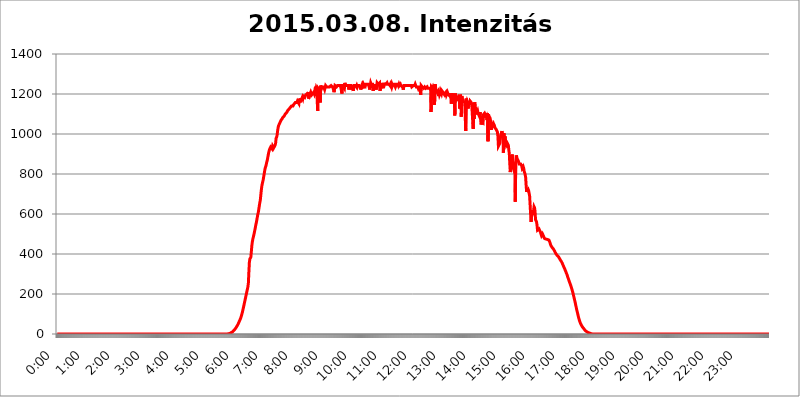
| Category | 2015.03.08. Intenzitás [W/m^2] |
|---|---|
| 0.0 | -0.256 |
| 0.0006944444444444445 | -0.256 |
| 0.001388888888888889 | -0.256 |
| 0.0020833333333333333 | -0.256 |
| 0.002777777777777778 | -0.256 |
| 0.003472222222222222 | -0.256 |
| 0.004166666666666667 | -0.256 |
| 0.004861111111111111 | -0.256 |
| 0.005555555555555556 | -0.256 |
| 0.0062499999999999995 | -0.256 |
| 0.006944444444444444 | -0.256 |
| 0.007638888888888889 | -0.256 |
| 0.008333333333333333 | -0.256 |
| 0.009027777777777779 | -0.256 |
| 0.009722222222222222 | -0.256 |
| 0.010416666666666666 | -0.256 |
| 0.011111111111111112 | -0.256 |
| 0.011805555555555555 | -0.256 |
| 0.012499999999999999 | -0.256 |
| 0.013194444444444444 | -0.256 |
| 0.013888888888888888 | -0.256 |
| 0.014583333333333332 | -0.256 |
| 0.015277777777777777 | -0.256 |
| 0.015972222222222224 | -0.256 |
| 0.016666666666666666 | -0.256 |
| 0.017361111111111112 | -0.256 |
| 0.018055555555555557 | -0.256 |
| 0.01875 | -0.256 |
| 0.019444444444444445 | -0.256 |
| 0.02013888888888889 | -0.256 |
| 0.020833333333333332 | -0.256 |
| 0.02152777777777778 | -0.256 |
| 0.022222222222222223 | -0.256 |
| 0.02291666666666667 | -0.256 |
| 0.02361111111111111 | -0.256 |
| 0.024305555555555556 | -0.256 |
| 0.024999999999999998 | -0.256 |
| 0.025694444444444447 | -0.256 |
| 0.02638888888888889 | -0.256 |
| 0.027083333333333334 | -0.256 |
| 0.027777777777777776 | -0.256 |
| 0.02847222222222222 | -0.256 |
| 0.029166666666666664 | -0.256 |
| 0.029861111111111113 | -0.256 |
| 0.030555555555555555 | -0.256 |
| 0.03125 | -0.256 |
| 0.03194444444444445 | -0.256 |
| 0.03263888888888889 | -0.256 |
| 0.03333333333333333 | -0.256 |
| 0.034027777777777775 | -0.256 |
| 0.034722222222222224 | -0.256 |
| 0.035416666666666666 | -0.256 |
| 0.036111111111111115 | -0.256 |
| 0.03680555555555556 | -0.256 |
| 0.0375 | -0.256 |
| 0.03819444444444444 | -0.256 |
| 0.03888888888888889 | -0.256 |
| 0.03958333333333333 | -0.256 |
| 0.04027777777777778 | -0.256 |
| 0.04097222222222222 | -0.256 |
| 0.041666666666666664 | -0.256 |
| 0.042361111111111106 | -0.256 |
| 0.04305555555555556 | -0.256 |
| 0.043750000000000004 | -0.256 |
| 0.044444444444444446 | -0.256 |
| 0.04513888888888889 | -0.256 |
| 0.04583333333333334 | -0.256 |
| 0.04652777777777778 | -0.256 |
| 0.04722222222222222 | -0.256 |
| 0.04791666666666666 | -0.256 |
| 0.04861111111111111 | -0.256 |
| 0.049305555555555554 | -0.256 |
| 0.049999999999999996 | -0.256 |
| 0.05069444444444445 | -0.256 |
| 0.051388888888888894 | -0.256 |
| 0.052083333333333336 | -0.256 |
| 0.05277777777777778 | -0.256 |
| 0.05347222222222222 | -0.256 |
| 0.05416666666666667 | -0.256 |
| 0.05486111111111111 | -0.256 |
| 0.05555555555555555 | -0.256 |
| 0.05625 | -0.256 |
| 0.05694444444444444 | -0.256 |
| 0.057638888888888885 | -0.256 |
| 0.05833333333333333 | -0.256 |
| 0.05902777777777778 | -0.256 |
| 0.059722222222222225 | -0.256 |
| 0.06041666666666667 | -0.256 |
| 0.061111111111111116 | -0.256 |
| 0.06180555555555556 | -0.256 |
| 0.0625 | -0.256 |
| 0.06319444444444444 | -0.256 |
| 0.06388888888888888 | -0.256 |
| 0.06458333333333334 | -0.256 |
| 0.06527777777777778 | -0.256 |
| 0.06597222222222222 | -0.256 |
| 0.06666666666666667 | -0.256 |
| 0.06736111111111111 | -0.256 |
| 0.06805555555555555 | -0.256 |
| 0.06874999999999999 | -0.256 |
| 0.06944444444444443 | -0.256 |
| 0.07013888888888889 | -0.256 |
| 0.07083333333333333 | -0.256 |
| 0.07152777777777779 | -0.256 |
| 0.07222222222222223 | -0.256 |
| 0.07291666666666667 | -0.256 |
| 0.07361111111111111 | -0.256 |
| 0.07430555555555556 | -0.256 |
| 0.075 | -0.256 |
| 0.07569444444444444 | -0.256 |
| 0.0763888888888889 | -0.256 |
| 0.07708333333333334 | -0.256 |
| 0.07777777777777778 | -0.256 |
| 0.07847222222222222 | -0.256 |
| 0.07916666666666666 | -0.256 |
| 0.0798611111111111 | -0.256 |
| 0.08055555555555556 | -0.256 |
| 0.08125 | -0.256 |
| 0.08194444444444444 | -0.256 |
| 0.08263888888888889 | -0.256 |
| 0.08333333333333333 | -0.256 |
| 0.08402777777777777 | -0.256 |
| 0.08472222222222221 | -0.256 |
| 0.08541666666666665 | -0.256 |
| 0.08611111111111112 | -0.256 |
| 0.08680555555555557 | -0.256 |
| 0.08750000000000001 | -0.256 |
| 0.08819444444444445 | -0.256 |
| 0.08888888888888889 | -0.256 |
| 0.08958333333333333 | -0.256 |
| 0.09027777777777778 | -0.256 |
| 0.09097222222222222 | -0.256 |
| 0.09166666666666667 | -0.256 |
| 0.09236111111111112 | -0.256 |
| 0.09305555555555556 | -0.256 |
| 0.09375 | -0.256 |
| 0.09444444444444444 | -0.256 |
| 0.09513888888888888 | -0.256 |
| 0.09583333333333333 | -0.256 |
| 0.09652777777777777 | -0.256 |
| 0.09722222222222222 | -0.256 |
| 0.09791666666666667 | -0.256 |
| 0.09861111111111111 | -0.256 |
| 0.09930555555555555 | -0.256 |
| 0.09999999999999999 | -0.256 |
| 0.10069444444444443 | -0.256 |
| 0.1013888888888889 | -0.256 |
| 0.10208333333333335 | -0.256 |
| 0.10277777777777779 | -0.256 |
| 0.10347222222222223 | -0.256 |
| 0.10416666666666667 | -0.256 |
| 0.10486111111111111 | -0.256 |
| 0.10555555555555556 | -0.256 |
| 0.10625 | -0.256 |
| 0.10694444444444444 | -0.256 |
| 0.1076388888888889 | -0.256 |
| 0.10833333333333334 | -0.256 |
| 0.10902777777777778 | -0.256 |
| 0.10972222222222222 | -0.256 |
| 0.1111111111111111 | -0.256 |
| 0.11180555555555556 | -0.256 |
| 0.11180555555555556 | -0.256 |
| 0.1125 | -0.256 |
| 0.11319444444444444 | -0.256 |
| 0.11388888888888889 | -0.256 |
| 0.11458333333333333 | -0.256 |
| 0.11527777777777777 | -0.256 |
| 0.11597222222222221 | -0.256 |
| 0.11666666666666665 | -0.256 |
| 0.1173611111111111 | -0.256 |
| 0.11805555555555557 | -0.256 |
| 0.11944444444444445 | -0.256 |
| 0.12013888888888889 | -0.256 |
| 0.12083333333333333 | -0.256 |
| 0.12152777777777778 | -0.256 |
| 0.12222222222222223 | -0.256 |
| 0.12291666666666667 | -0.256 |
| 0.12291666666666667 | -0.256 |
| 0.12361111111111112 | -0.256 |
| 0.12430555555555556 | -0.256 |
| 0.125 | -0.256 |
| 0.12569444444444444 | -0.256 |
| 0.12638888888888888 | -0.256 |
| 0.12708333333333333 | -0.256 |
| 0.16875 | -0.256 |
| 0.12847222222222224 | -0.256 |
| 0.12916666666666668 | -0.256 |
| 0.12986111111111112 | -0.256 |
| 0.13055555555555556 | -0.256 |
| 0.13125 | -0.256 |
| 0.13194444444444445 | -0.256 |
| 0.1326388888888889 | -0.256 |
| 0.13333333333333333 | -0.256 |
| 0.13402777777777777 | -0.256 |
| 0.13402777777777777 | -0.256 |
| 0.13472222222222222 | -0.256 |
| 0.13541666666666666 | -0.256 |
| 0.1361111111111111 | -0.256 |
| 0.13749999999999998 | -0.256 |
| 0.13819444444444443 | -0.256 |
| 0.1388888888888889 | -0.256 |
| 0.13958333333333334 | -0.256 |
| 0.14027777777777778 | -0.256 |
| 0.14097222222222222 | -0.256 |
| 0.14166666666666666 | -0.256 |
| 0.1423611111111111 | -0.256 |
| 0.14305555555555557 | -0.256 |
| 0.14375000000000002 | -0.256 |
| 0.14444444444444446 | -0.256 |
| 0.1451388888888889 | -0.256 |
| 0.1451388888888889 | -0.256 |
| 0.14652777777777778 | -0.256 |
| 0.14722222222222223 | -0.256 |
| 0.14791666666666667 | -0.256 |
| 0.1486111111111111 | -0.256 |
| 0.14930555555555555 | -0.256 |
| 0.15 | -0.256 |
| 0.15069444444444444 | -0.256 |
| 0.15138888888888888 | -0.256 |
| 0.15208333333333332 | -0.256 |
| 0.15277777777777776 | -0.256 |
| 0.15347222222222223 | -0.256 |
| 0.15416666666666667 | -0.256 |
| 0.15486111111111112 | -0.256 |
| 0.15555555555555556 | -0.256 |
| 0.15625 | -0.256 |
| 0.15694444444444444 | -0.256 |
| 0.15763888888888888 | -0.256 |
| 0.15833333333333333 | -0.256 |
| 0.15902777777777777 | -0.256 |
| 0.15972222222222224 | -0.256 |
| 0.16041666666666668 | -0.256 |
| 0.16111111111111112 | -0.256 |
| 0.16180555555555556 | -0.256 |
| 0.1625 | -0.256 |
| 0.16319444444444445 | -0.256 |
| 0.1638888888888889 | -0.256 |
| 0.16458333333333333 | -0.256 |
| 0.16527777777777777 | -0.256 |
| 0.16597222222222222 | -0.256 |
| 0.16666666666666666 | -0.256 |
| 0.1673611111111111 | -0.256 |
| 0.16805555555555554 | -0.256 |
| 0.16874999999999998 | -0.256 |
| 0.16944444444444443 | -0.256 |
| 0.17013888888888887 | -0.256 |
| 0.1708333333333333 | -0.256 |
| 0.17152777777777775 | -0.256 |
| 0.17222222222222225 | -0.256 |
| 0.1729166666666667 | -0.256 |
| 0.17361111111111113 | -0.256 |
| 0.17430555555555557 | -0.256 |
| 0.17500000000000002 | -0.256 |
| 0.17569444444444446 | -0.256 |
| 0.1763888888888889 | -0.256 |
| 0.17708333333333334 | -0.256 |
| 0.17777777777777778 | -0.256 |
| 0.17847222222222223 | -0.256 |
| 0.17916666666666667 | -0.256 |
| 0.1798611111111111 | -0.256 |
| 0.18055555555555555 | -0.256 |
| 0.18125 | -0.256 |
| 0.18194444444444444 | -0.256 |
| 0.1826388888888889 | -0.256 |
| 0.18333333333333335 | -0.256 |
| 0.1840277777777778 | -0.256 |
| 0.18472222222222223 | -0.256 |
| 0.18541666666666667 | -0.256 |
| 0.18611111111111112 | -0.256 |
| 0.18680555555555556 | -0.256 |
| 0.1875 | -0.256 |
| 0.18819444444444444 | -0.256 |
| 0.18888888888888888 | -0.256 |
| 0.18958333333333333 | -0.256 |
| 0.19027777777777777 | -0.256 |
| 0.1909722222222222 | -0.256 |
| 0.19166666666666665 | -0.256 |
| 0.19236111111111112 | -0.256 |
| 0.19305555555555554 | -0.256 |
| 0.19375 | -0.256 |
| 0.19444444444444445 | -0.256 |
| 0.1951388888888889 | -0.256 |
| 0.19583333333333333 | -0.256 |
| 0.19652777777777777 | -0.256 |
| 0.19722222222222222 | -0.256 |
| 0.19791666666666666 | -0.256 |
| 0.1986111111111111 | -0.256 |
| 0.19930555555555554 | -0.256 |
| 0.19999999999999998 | -0.256 |
| 0.20069444444444443 | -0.256 |
| 0.20138888888888887 | -0.256 |
| 0.2020833333333333 | -0.256 |
| 0.2027777777777778 | -0.256 |
| 0.2034722222222222 | -0.256 |
| 0.2041666666666667 | -0.256 |
| 0.20486111111111113 | -0.256 |
| 0.20555555555555557 | -0.256 |
| 0.20625000000000002 | -0.256 |
| 0.20694444444444446 | -0.256 |
| 0.2076388888888889 | -0.256 |
| 0.20833333333333334 | -0.256 |
| 0.20902777777777778 | -0.256 |
| 0.20972222222222223 | -0.256 |
| 0.21041666666666667 | -0.256 |
| 0.2111111111111111 | -0.256 |
| 0.21180555555555555 | -0.256 |
| 0.2125 | -0.256 |
| 0.21319444444444444 | -0.256 |
| 0.2138888888888889 | -0.256 |
| 0.21458333333333335 | -0.256 |
| 0.2152777777777778 | -0.256 |
| 0.21597222222222223 | -0.256 |
| 0.21666666666666667 | -0.256 |
| 0.21736111111111112 | -0.256 |
| 0.21805555555555556 | -0.256 |
| 0.21875 | -0.256 |
| 0.21944444444444444 | -0.256 |
| 0.22013888888888888 | -0.256 |
| 0.22083333333333333 | -0.256 |
| 0.22152777777777777 | -0.256 |
| 0.2222222222222222 | -0.256 |
| 0.22291666666666665 | -0.256 |
| 0.2236111111111111 | -0.256 |
| 0.22430555555555556 | -0.256 |
| 0.225 | -0.256 |
| 0.22569444444444445 | -0.256 |
| 0.2263888888888889 | -0.256 |
| 0.22708333333333333 | -0.256 |
| 0.22777777777777777 | -0.256 |
| 0.22847222222222222 | -0.256 |
| 0.22916666666666666 | -0.256 |
| 0.2298611111111111 | -0.256 |
| 0.23055555555555554 | -0.256 |
| 0.23124999999999998 | -0.256 |
| 0.23194444444444443 | -0.256 |
| 0.23263888888888887 | -0.256 |
| 0.2333333333333333 | -0.256 |
| 0.2340277777777778 | -0.256 |
| 0.2347222222222222 | -0.256 |
| 0.2354166666666667 | -0.256 |
| 0.23611111111111113 | -0.256 |
| 0.23680555555555557 | -0.256 |
| 0.23750000000000002 | -0.256 |
| 0.23819444444444446 | 1.09 |
| 0.2388888888888889 | 1.09 |
| 0.23958333333333334 | 1.09 |
| 0.24027777777777778 | 1.09 |
| 0.24097222222222223 | 1.09 |
| 0.24166666666666667 | 2.439 |
| 0.2423611111111111 | 3.791 |
| 0.24305555555555555 | 3.791 |
| 0.24375 | 6.503 |
| 0.24444444444444446 | 7.862 |
| 0.24513888888888888 | 9.225 |
| 0.24583333333333335 | 10.589 |
| 0.2465277777777778 | 13.325 |
| 0.24722222222222223 | 16.069 |
| 0.24791666666666667 | 17.444 |
| 0.24861111111111112 | 20.201 |
| 0.24930555555555556 | 24.35 |
| 0.25 | 27.124 |
| 0.25069444444444444 | 31.297 |
| 0.2513888888888889 | 35.483 |
| 0.2520833333333333 | 39.68 |
| 0.25277777777777777 | 43.886 |
| 0.2534722222222222 | 48.1 |
| 0.25416666666666665 | 53.73 |
| 0.2548611111111111 | 59.368 |
| 0.2555555555555556 | 65.012 |
| 0.25625000000000003 | 70.658 |
| 0.2569444444444445 | 76.304 |
| 0.2576388888888889 | 83.356 |
| 0.25833333333333336 | 91.806 |
| 0.2590277777777778 | 100.233 |
| 0.25972222222222224 | 110.025 |
| 0.2604166666666667 | 121.152 |
| 0.2611111111111111 | 132.196 |
| 0.26180555555555557 | 143.144 |
| 0.2625 | 155.333 |
| 0.26319444444444445 | 166.044 |
| 0.2638888888888889 | 177.946 |
| 0.26458333333333334 | 189.685 |
| 0.2652777777777778 | 201.258 |
| 0.2659722222222222 | 212.664 |
| 0.26666666666666666 | 223.906 |
| 0.2673611111111111 | 234.99 |
| 0.26805555555555555 | 254.333 |
| 0.26875 | 308.129 |
| 0.26944444444444443 | 357.196 |
| 0.2701388888888889 | 375.442 |
| 0.2708333333333333 | 374.206 |
| 0.27152777777777776 | 384.191 |
| 0.2722222222222222 | 411.638 |
| 0.27291666666666664 | 441.469 |
| 0.2736111111111111 | 459.898 |
| 0.2743055555555555 | 474.507 |
| 0.27499999999999997 | 484.662 |
| 0.27569444444444446 | 495.176 |
| 0.27638888888888885 | 506.072 |
| 0.27708333333333335 | 519.3 |
| 0.2777777777777778 | 531.108 |
| 0.27847222222222223 | 545.467 |
| 0.2791666666666667 | 556.131 |
| 0.2798611111111111 | 569.398 |
| 0.28055555555555556 | 583.206 |
| 0.28125 | 597.582 |
| 0.28194444444444444 | 607.495 |
| 0.2826388888888889 | 622.881 |
| 0.2833333333333333 | 638.912 |
| 0.28402777777777777 | 655.618 |
| 0.2847222222222222 | 667.146 |
| 0.28541666666666665 | 691.18 |
| 0.28611111111111115 | 716.58 |
| 0.28680555555555554 | 736.574 |
| 0.28750000000000003 | 750.371 |
| 0.2881944444444445 | 760.972 |
| 0.2888888888888889 | 771.794 |
| 0.28958333333333336 | 786.575 |
| 0.2902777777777778 | 801.768 |
| 0.29097222222222224 | 817.382 |
| 0.2916666666666667 | 829.377 |
| 0.2923611111111111 | 837.51 |
| 0.29305555555555557 | 845.755 |
| 0.29375 | 858.335 |
| 0.29444444444444445 | 866.865 |
| 0.2951388888888889 | 879.878 |
| 0.29583333333333334 | 893.157 |
| 0.2965277777777778 | 906.707 |
| 0.2972222222222222 | 915.893 |
| 0.29791666666666666 | 925.203 |
| 0.2986111111111111 | 929.905 |
| 0.29930555555555555 | 934.639 |
| 0.3 | 934.639 |
| 0.30069444444444443 | 929.905 |
| 0.3013888888888889 | 925.203 |
| 0.3020833333333333 | 939.404 |
| 0.30277777777777776 | 939.404 |
| 0.3034722222222222 | 929.905 |
| 0.30416666666666664 | 934.639 |
| 0.3048611111111111 | 929.905 |
| 0.3055555555555555 | 944.201 |
| 0.30624999999999997 | 953.892 |
| 0.3069444444444444 | 978.688 |
| 0.3076388888888889 | 983.747 |
| 0.30833333333333335 | 993.965 |
| 0.3090277777777778 | 1014.809 |
| 0.30972222222222223 | 1030.804 |
| 0.3104166666666667 | 1041.644 |
| 0.3111111111111111 | 1047.117 |
| 0.31180555555555556 | 1052.625 |
| 0.3125 | 1058.17 |
| 0.31319444444444444 | 1063.751 |
| 0.3138888888888889 | 1069.368 |
| 0.3145833333333333 | 1069.368 |
| 0.31527777777777777 | 1075.021 |
| 0.3159722222222222 | 1080.711 |
| 0.31666666666666665 | 1080.711 |
| 0.31736111111111115 | 1086.439 |
| 0.31805555555555554 | 1086.439 |
| 0.31875000000000003 | 1092.203 |
| 0.3194444444444445 | 1098.004 |
| 0.3201388888888889 | 1098.004 |
| 0.32083333333333336 | 1103.843 |
| 0.3215277777777778 | 1103.843 |
| 0.32222222222222224 | 1109.72 |
| 0.3229166666666667 | 1115.634 |
| 0.3236111111111111 | 1115.634 |
| 0.32430555555555557 | 1121.587 |
| 0.325 | 1121.587 |
| 0.32569444444444445 | 1127.578 |
| 0.3263888888888889 | 1127.578 |
| 0.32708333333333334 | 1133.607 |
| 0.3277777777777778 | 1133.607 |
| 0.3284722222222222 | 1139.675 |
| 0.32916666666666666 | 1139.675 |
| 0.3298611111111111 | 1139.675 |
| 0.33055555555555555 | 1139.675 |
| 0.33125 | 1145.782 |
| 0.33194444444444443 | 1145.782 |
| 0.3326388888888889 | 1151.928 |
| 0.3333333333333333 | 1151.928 |
| 0.3340277777777778 | 1158.113 |
| 0.3347222222222222 | 1158.113 |
| 0.3354166666666667 | 1158.113 |
| 0.3361111111111111 | 1158.113 |
| 0.3368055555555556 | 1164.337 |
| 0.33749999999999997 | 1164.337 |
| 0.33819444444444446 | 1164.337 |
| 0.33888888888888885 | 1151.928 |
| 0.33958333333333335 | 1176.905 |
| 0.34027777777777773 | 1176.905 |
| 0.34097222222222223 | 1158.113 |
| 0.3416666666666666 | 1176.905 |
| 0.3423611111111111 | 1164.337 |
| 0.3430555555555555 | 1176.905 |
| 0.34375 | 1183.249 |
| 0.3444444444444445 | 1176.905 |
| 0.3451388888888889 | 1189.633 |
| 0.3458333333333334 | 1189.633 |
| 0.34652777777777777 | 1189.633 |
| 0.34722222222222227 | 1183.249 |
| 0.34791666666666665 | 1189.633 |
| 0.34861111111111115 | 1196.058 |
| 0.34930555555555554 | 1196.058 |
| 0.35000000000000003 | 1196.058 |
| 0.3506944444444444 | 1202.523 |
| 0.3513888888888889 | 1202.523 |
| 0.3520833333333333 | 1196.058 |
| 0.3527777777777778 | 1176.905 |
| 0.3534722222222222 | 1209.029 |
| 0.3541666666666667 | 1196.058 |
| 0.3548611111111111 | 1202.523 |
| 0.35555555555555557 | 1209.029 |
| 0.35625 | 1209.029 |
| 0.35694444444444445 | 1196.058 |
| 0.3576388888888889 | 1196.058 |
| 0.35833333333333334 | 1202.523 |
| 0.3590277777777778 | 1202.523 |
| 0.3597222222222222 | 1209.029 |
| 0.36041666666666666 | 1202.523 |
| 0.3611111111111111 | 1215.576 |
| 0.36180555555555555 | 1209.029 |
| 0.3625 | 1215.576 |
| 0.36319444444444443 | 1228.794 |
| 0.3638888888888889 | 1222.164 |
| 0.3645833333333333 | 1222.164 |
| 0.3652777777777778 | 1115.634 |
| 0.3659722222222222 | 1228.794 |
| 0.3666666666666667 | 1228.794 |
| 0.3673611111111111 | 1222.164 |
| 0.3680555555555556 | 1235.465 |
| 0.36874999999999997 | 1158.113 |
| 0.36944444444444446 | 1242.179 |
| 0.37013888888888885 | 1235.465 |
| 0.37083333333333335 | 1228.794 |
| 0.37152777777777773 | 1235.465 |
| 0.37222222222222223 | 1235.465 |
| 0.3729166666666666 | 1235.465 |
| 0.3736111111111111 | 1235.465 |
| 0.3743055555555555 | 1235.465 |
| 0.375 | 1222.164 |
| 0.3756944444444445 | 1222.164 |
| 0.3763888888888889 | 1242.179 |
| 0.3770833333333334 | 1242.179 |
| 0.37777777777777777 | 1235.465 |
| 0.37847222222222227 | 1235.465 |
| 0.37916666666666665 | 1235.465 |
| 0.37986111111111115 | 1235.465 |
| 0.38055555555555554 | 1235.465 |
| 0.38125000000000003 | 1235.465 |
| 0.3819444444444444 | 1235.465 |
| 0.3826388888888889 | 1235.465 |
| 0.3833333333333333 | 1235.465 |
| 0.3840277777777778 | 1242.179 |
| 0.3847222222222222 | 1242.179 |
| 0.3854166666666667 | 1242.179 |
| 0.3861111111111111 | 1235.465 |
| 0.38680555555555557 | 1235.465 |
| 0.3875 | 1222.164 |
| 0.38819444444444445 | 1209.029 |
| 0.3888888888888889 | 1209.029 |
| 0.38958333333333334 | 1242.179 |
| 0.3902777777777778 | 1242.179 |
| 0.3909722222222222 | 1242.179 |
| 0.39166666666666666 | 1235.465 |
| 0.3923611111111111 | 1235.465 |
| 0.39305555555555555 | 1242.179 |
| 0.39375 | 1242.179 |
| 0.39444444444444443 | 1242.179 |
| 0.3951388888888889 | 1242.179 |
| 0.3958333333333333 | 1242.179 |
| 0.3965277777777778 | 1242.179 |
| 0.3972222222222222 | 1242.179 |
| 0.3979166666666667 | 1228.794 |
| 0.3986111111111111 | 1228.794 |
| 0.3993055555555556 | 1202.523 |
| 0.39999999999999997 | 1248.934 |
| 0.40069444444444446 | 1242.179 |
| 0.40138888888888885 | 1242.179 |
| 0.40208333333333335 | 1242.179 |
| 0.40277777777777773 | 1228.794 |
| 0.40347222222222223 | 1255.731 |
| 0.4041666666666666 | 1242.179 |
| 0.4048611111111111 | 1242.179 |
| 0.4055555555555555 | 1242.179 |
| 0.40625 | 1242.179 |
| 0.4069444444444445 | 1242.179 |
| 0.4076388888888889 | 1242.179 |
| 0.4083333333333334 | 1242.179 |
| 0.40902777777777777 | 1222.164 |
| 0.40972222222222227 | 1242.179 |
| 0.41041666666666665 | 1242.179 |
| 0.41111111111111115 | 1242.179 |
| 0.41180555555555554 | 1242.179 |
| 0.41250000000000003 | 1242.179 |
| 0.4131944444444444 | 1222.164 |
| 0.4138888888888889 | 1242.179 |
| 0.4145833333333333 | 1242.179 |
| 0.4152777777777778 | 1215.576 |
| 0.4159722222222222 | 1242.179 |
| 0.4166666666666667 | 1242.179 |
| 0.4173611111111111 | 1242.179 |
| 0.41805555555555557 | 1242.179 |
| 0.41875 | 1242.179 |
| 0.41944444444444445 | 1235.465 |
| 0.4201388888888889 | 1242.179 |
| 0.42083333333333334 | 1235.465 |
| 0.4215277777777778 | 1242.179 |
| 0.4222222222222222 | 1242.179 |
| 0.42291666666666666 | 1242.179 |
| 0.4236111111111111 | 1242.179 |
| 0.42430555555555555 | 1242.179 |
| 0.425 | 1235.465 |
| 0.42569444444444443 | 1222.164 |
| 0.4263888888888889 | 1235.465 |
| 0.4270833333333333 | 1235.465 |
| 0.4277777777777778 | 1248.934 |
| 0.4284722222222222 | 1242.179 |
| 0.4291666666666667 | 1248.934 |
| 0.4298611111111111 | 1248.934 |
| 0.4305555555555556 | 1235.465 |
| 0.43124999999999997 | 1228.794 |
| 0.43194444444444446 | 1248.934 |
| 0.43263888888888885 | 1248.934 |
| 0.43333333333333335 | 1248.934 |
| 0.43402777777777773 | 1248.934 |
| 0.43472222222222223 | 1248.934 |
| 0.4354166666666666 | 1248.934 |
| 0.4361111111111111 | 1248.934 |
| 0.4368055555555555 | 1248.934 |
| 0.4375 | 1235.465 |
| 0.4381944444444445 | 1222.164 |
| 0.4388888888888889 | 1242.179 |
| 0.4395833333333334 | 1255.731 |
| 0.44027777777777777 | 1248.934 |
| 0.44097222222222227 | 1248.934 |
| 0.44166666666666665 | 1248.934 |
| 0.44236111111111115 | 1248.934 |
| 0.44305555555555554 | 1215.576 |
| 0.44375000000000003 | 1228.794 |
| 0.4444444444444444 | 1248.934 |
| 0.4451388888888889 | 1235.465 |
| 0.4458333333333333 | 1248.934 |
| 0.4465277777777778 | 1248.934 |
| 0.4472222222222222 | 1222.164 |
| 0.4479166666666667 | 1235.465 |
| 0.4486111111111111 | 1255.731 |
| 0.44930555555555557 | 1255.731 |
| 0.45 | 1248.934 |
| 0.45069444444444445 | 1248.934 |
| 0.4513888888888889 | 1248.934 |
| 0.45208333333333334 | 1255.731 |
| 0.4527777777777778 | 1215.576 |
| 0.4534722222222222 | 1248.934 |
| 0.45416666666666666 | 1248.934 |
| 0.4548611111111111 | 1248.934 |
| 0.45555555555555555 | 1248.934 |
| 0.45625 | 1248.934 |
| 0.45694444444444443 | 1248.934 |
| 0.4576388888888889 | 1228.794 |
| 0.4583333333333333 | 1255.731 |
| 0.4590277777777778 | 1248.934 |
| 0.4597222222222222 | 1248.934 |
| 0.4604166666666667 | 1248.934 |
| 0.4611111111111111 | 1248.934 |
| 0.4618055555555556 | 1248.934 |
| 0.46249999999999997 | 1255.731 |
| 0.46319444444444446 | 1248.934 |
| 0.46388888888888885 | 1248.934 |
| 0.46458333333333335 | 1248.934 |
| 0.46527777777777773 | 1248.934 |
| 0.46597222222222223 | 1248.934 |
| 0.4666666666666666 | 1242.179 |
| 0.4673611111111111 | 1248.934 |
| 0.4680555555555555 | 1242.179 |
| 0.46875 | 1235.465 |
| 0.4694444444444445 | 1248.934 |
| 0.4701388888888889 | 1242.179 |
| 0.4708333333333334 | 1248.934 |
| 0.47152777777777777 | 1248.934 |
| 0.47222222222222227 | 1248.934 |
| 0.47291666666666665 | 1248.934 |
| 0.47361111111111115 | 1248.934 |
| 0.47430555555555554 | 1235.465 |
| 0.47500000000000003 | 1235.465 |
| 0.4756944444444444 | 1248.934 |
| 0.4763888888888889 | 1248.934 |
| 0.4770833333333333 | 1248.934 |
| 0.4777777777777778 | 1248.934 |
| 0.4784722222222222 | 1242.179 |
| 0.4791666666666667 | 1248.934 |
| 0.4798611111111111 | 1242.179 |
| 0.48055555555555557 | 1242.179 |
| 0.48125 | 1248.934 |
| 0.48194444444444445 | 1242.179 |
| 0.4826388888888889 | 1242.179 |
| 0.48333333333333334 | 1242.179 |
| 0.4840277777777778 | 1235.465 |
| 0.4847222222222222 | 1242.179 |
| 0.48541666666666666 | 1222.164 |
| 0.4861111111111111 | 1242.179 |
| 0.48680555555555555 | 1242.179 |
| 0.4875 | 1242.179 |
| 0.48819444444444443 | 1242.179 |
| 0.4888888888888889 | 1242.179 |
| 0.4895833333333333 | 1242.179 |
| 0.4902777777777778 | 1242.179 |
| 0.4909722222222222 | 1242.179 |
| 0.4916666666666667 | 1242.179 |
| 0.4923611111111111 | 1242.179 |
| 0.4930555555555556 | 1242.179 |
| 0.49374999999999997 | 1242.179 |
| 0.49444444444444446 | 1242.179 |
| 0.49513888888888885 | 1242.179 |
| 0.49583333333333335 | 1242.179 |
| 0.49652777777777773 | 1242.179 |
| 0.49722222222222223 | 1235.465 |
| 0.4979166666666666 | 1235.465 |
| 0.4986111111111111 | 1235.465 |
| 0.4993055555555555 | 1242.179 |
| 0.5 | 1242.179 |
| 0.5006944444444444 | 1242.179 |
| 0.5013888888888889 | 1242.179 |
| 0.5020833333333333 | 1248.934 |
| 0.5027777777777778 | 1242.179 |
| 0.5034722222222222 | 1235.465 |
| 0.5041666666666667 | 1235.465 |
| 0.5048611111111111 | 1235.465 |
| 0.5055555555555555 | 1235.465 |
| 0.50625 | 1228.794 |
| 0.5069444444444444 | 1235.465 |
| 0.5076388888888889 | 1235.465 |
| 0.5083333333333333 | 1235.465 |
| 0.5090277777777777 | 1235.465 |
| 0.5097222222222222 | 1196.058 |
| 0.5104166666666666 | 1242.179 |
| 0.5111111111111112 | 1242.179 |
| 0.5118055555555555 | 1235.465 |
| 0.5125000000000001 | 1235.465 |
| 0.5131944444444444 | 1235.465 |
| 0.513888888888889 | 1228.794 |
| 0.5145833333333333 | 1228.794 |
| 0.5152777777777778 | 1235.465 |
| 0.5159722222222222 | 1235.465 |
| 0.5166666666666667 | 1228.794 |
| 0.517361111111111 | 1228.794 |
| 0.5180555555555556 | 1228.794 |
| 0.5187499999999999 | 1235.465 |
| 0.5194444444444445 | 1228.794 |
| 0.5201388888888888 | 1228.794 |
| 0.5208333333333334 | 1228.794 |
| 0.5215277777777778 | 1228.794 |
| 0.5222222222222223 | 1228.794 |
| 0.5229166666666667 | 1228.794 |
| 0.5236111111111111 | 1228.794 |
| 0.5243055555555556 | 1109.72 |
| 0.525 | 1235.465 |
| 0.5256944444444445 | 1235.465 |
| 0.5263888888888889 | 1228.794 |
| 0.5270833333333333 | 1235.465 |
| 0.5277777777777778 | 1228.794 |
| 0.5284722222222222 | 1215.576 |
| 0.5291666666666667 | 1145.782 |
| 0.5298611111111111 | 1248.934 |
| 0.5305555555555556 | 1235.465 |
| 0.53125 | 1235.465 |
| 0.5319444444444444 | 1202.523 |
| 0.5326388888888889 | 1209.029 |
| 0.5333333333333333 | 1209.029 |
| 0.5340277777777778 | 1215.576 |
| 0.5347222222222222 | 1189.633 |
| 0.5354166666666667 | 1209.029 |
| 0.5361111111111111 | 1196.058 |
| 0.5368055555555555 | 1202.523 |
| 0.5375 | 1215.576 |
| 0.5381944444444444 | 1215.576 |
| 0.5388888888888889 | 1202.523 |
| 0.5395833333333333 | 1215.576 |
| 0.5402777777777777 | 1215.576 |
| 0.5409722222222222 | 1209.029 |
| 0.5416666666666666 | 1202.523 |
| 0.5423611111111112 | 1202.523 |
| 0.5430555555555555 | 1196.058 |
| 0.5437500000000001 | 1202.523 |
| 0.5444444444444444 | 1202.523 |
| 0.545138888888889 | 1209.029 |
| 0.5458333333333333 | 1196.058 |
| 0.5465277777777778 | 1196.058 |
| 0.5472222222222222 | 1209.029 |
| 0.5479166666666667 | 1202.523 |
| 0.548611111111111 | 1196.058 |
| 0.5493055555555556 | 1196.058 |
| 0.5499999999999999 | 1196.058 |
| 0.5506944444444445 | 1189.633 |
| 0.5513888888888888 | 1196.058 |
| 0.5520833333333334 | 1202.523 |
| 0.5527777777777778 | 1151.928 |
| 0.5534722222222223 | 1202.523 |
| 0.5541666666666667 | 1196.058 |
| 0.5548611111111111 | 1202.523 |
| 0.5555555555555556 | 1164.337 |
| 0.55625 | 1196.058 |
| 0.5569444444444445 | 1183.249 |
| 0.5576388888888889 | 1092.203 |
| 0.5583333333333333 | 1202.523 |
| 0.5590277777777778 | 1183.249 |
| 0.5597222222222222 | 1176.905 |
| 0.5604166666666667 | 1170.601 |
| 0.5611111111111111 | 1164.337 |
| 0.5618055555555556 | 1189.633 |
| 0.5625 | 1183.249 |
| 0.5631944444444444 | 1189.633 |
| 0.5638888888888889 | 1196.058 |
| 0.5645833333333333 | 1127.578 |
| 0.5652777777777778 | 1196.058 |
| 0.5659722222222222 | 1189.633 |
| 0.5666666666666667 | 1086.439 |
| 0.5673611111111111 | 1189.633 |
| 0.5680555555555555 | 1176.905 |
| 0.56875 | 1176.905 |
| 0.5694444444444444 | 1164.337 |
| 0.5701388888888889 | 1164.337 |
| 0.5708333333333333 | 1164.337 |
| 0.5715277777777777 | 1158.113 |
| 0.5722222222222222 | 1158.113 |
| 0.5729166666666666 | 1014.809 |
| 0.5736111111111112 | 1176.905 |
| 0.5743055555555555 | 1151.928 |
| 0.5750000000000001 | 1164.337 |
| 0.5756944444444444 | 1158.113 |
| 0.576388888888889 | 1127.578 |
| 0.5770833333333333 | 1164.337 |
| 0.5777777777777778 | 1164.337 |
| 0.5784722222222222 | 1145.782 |
| 0.5791666666666667 | 1164.337 |
| 0.579861111111111 | 1164.337 |
| 0.5805555555555556 | 1158.113 |
| 0.5812499999999999 | 1151.928 |
| 0.5819444444444445 | 1151.928 |
| 0.5826388888888888 | 1151.928 |
| 0.5833333333333334 | 1025.437 |
| 0.5840277777777778 | 1098.004 |
| 0.5847222222222223 | 1075.021 |
| 0.5854166666666667 | 1158.113 |
| 0.5861111111111111 | 1139.675 |
| 0.5868055555555556 | 1127.578 |
| 0.5875 | 1098.004 |
| 0.5881944444444445 | 1098.004 |
| 0.5888888888888889 | 1109.72 |
| 0.5895833333333333 | 1115.634 |
| 0.5902777777777778 | 1103.843 |
| 0.5909722222222222 | 1103.843 |
| 0.5916666666666667 | 1092.203 |
| 0.5923611111111111 | 1098.004 |
| 0.5930555555555556 | 1109.72 |
| 0.59375 | 1075.021 |
| 0.5944444444444444 | 1047.117 |
| 0.5951388888888889 | 1047.117 |
| 0.5958333333333333 | 1063.751 |
| 0.5965277777777778 | 1063.751 |
| 0.5972222222222222 | 1058.17 |
| 0.5979166666666667 | 1098.004 |
| 0.5986111111111111 | 1098.004 |
| 0.5993055555555555 | 1103.843 |
| 0.6 | 1098.004 |
| 0.6006944444444444 | 1103.843 |
| 0.6013888888888889 | 1080.711 |
| 0.6020833333333333 | 1086.439 |
| 0.6027777777777777 | 1069.368 |
| 0.6034722222222222 | 1103.843 |
| 0.6041666666666666 | 963.712 |
| 0.6048611111111112 | 1098.004 |
| 0.6055555555555555 | 1086.439 |
| 0.6062500000000001 | 1086.439 |
| 0.6069444444444444 | 1080.711 |
| 0.607638888888889 | 1069.368 |
| 0.6083333333333333 | 1063.751 |
| 0.6090277777777778 | 1020.106 |
| 0.6097222222222222 | 1058.17 |
| 0.6104166666666667 | 1058.17 |
| 0.611111111111111 | 1047.117 |
| 0.6118055555555556 | 1052.625 |
| 0.6124999999999999 | 1052.625 |
| 0.6131944444444445 | 1041.644 |
| 0.6138888888888888 | 1030.804 |
| 0.6145833333333334 | 1030.804 |
| 0.6152777777777778 | 1025.437 |
| 0.6159722222222223 | 1020.106 |
| 0.6166666666666667 | 1014.809 |
| 0.6173611111111111 | 1009.546 |
| 0.6180555555555556 | 988.839 |
| 0.61875 | 939.404 |
| 0.6194444444444445 | 934.639 |
| 0.6201388888888889 | 949.03 |
| 0.6208333333333333 | 953.892 |
| 0.6215277777777778 | 953.892 |
| 0.6222222222222222 | 993.965 |
| 0.6229166666666667 | 1004.318 |
| 0.6236111111111111 | 1014.809 |
| 0.6243055555555556 | 999.125 |
| 0.625 | 993.965 |
| 0.6256944444444444 | 906.707 |
| 0.6263888888888889 | 1004.318 |
| 0.6270833333333333 | 939.404 |
| 0.6277777777777778 | 988.839 |
| 0.6284722222222222 | 978.688 |
| 0.6291666666666667 | 958.785 |
| 0.6298611111111111 | 944.201 |
| 0.6305555555555555 | 939.404 |
| 0.63125 | 953.892 |
| 0.6319444444444444 | 953.892 |
| 0.6326388888888889 | 944.201 |
| 0.6333333333333333 | 920.533 |
| 0.6340277777777777 | 902.16 |
| 0.6347222222222222 | 849.92 |
| 0.6354166666666666 | 809.522 |
| 0.6361111111111112 | 854.113 |
| 0.6368055555555555 | 829.377 |
| 0.6375000000000001 | 849.92 |
| 0.6381944444444444 | 897.643 |
| 0.638888888888889 | 837.51 |
| 0.6395833333333333 | 829.377 |
| 0.6402777777777778 | 837.51 |
| 0.6409722222222222 | 837.51 |
| 0.6416666666666667 | 845.755 |
| 0.642361111111111 | 661.343 |
| 0.6430555555555556 | 862.585 |
| 0.6437499999999999 | 893.157 |
| 0.6444444444444445 | 884.274 |
| 0.6451388888888888 | 875.511 |
| 0.6458333333333334 | 875.511 |
| 0.6465277777777778 | 866.865 |
| 0.6472222222222223 | 862.585 |
| 0.6479166666666667 | 849.92 |
| 0.6486111111111111 | 854.113 |
| 0.6493055555555556 | 849.92 |
| 0.65 | 849.92 |
| 0.6506944444444445 | 845.755 |
| 0.6513888888888889 | 841.619 |
| 0.6520833333333333 | 829.377 |
| 0.6527777777777778 | 833.43 |
| 0.6534722222222222 | 837.51 |
| 0.6541666666666667 | 829.377 |
| 0.6548611111111111 | 813.439 |
| 0.6555555555555556 | 817.382 |
| 0.65625 | 797.931 |
| 0.6569444444444444 | 782.842 |
| 0.6576388888888889 | 743.425 |
| 0.6583333333333333 | 710.098 |
| 0.6590277777777778 | 716.58 |
| 0.6597222222222222 | 713.328 |
| 0.6604166666666667 | 723.153 |
| 0.6611111111111111 | 716.58 |
| 0.6618055555555555 | 719.855 |
| 0.6625 | 691.18 |
| 0.6631944444444444 | 647.179 |
| 0.6638888888888889 | 600.035 |
| 0.6645833333333333 | 560.495 |
| 0.6652777777777777 | 590.321 |
| 0.6659722222222222 | 595.145 |
| 0.6666666666666666 | 602.505 |
| 0.6673611111111111 | 602.505 |
| 0.6680555555555556 | 617.682 |
| 0.6687500000000001 | 636.194 |
| 0.6694444444444444 | 630.814 |
| 0.6701388888888888 | 612.554 |
| 0.6708333333333334 | 571.661 |
| 0.6715277777777778 | 576.233 |
| 0.6722222222222222 | 560.495 |
| 0.6729166666666666 | 543.376 |
| 0.6736111111111112 | 519.3 |
| 0.6743055555555556 | 523.186 |
| 0.6749999999999999 | 521.237 |
| 0.6756944444444444 | 525.148 |
| 0.6763888888888889 | 519.3 |
| 0.6770833333333334 | 523.186 |
| 0.6777777777777777 | 509.793 |
| 0.6784722222222223 | 498.764 |
| 0.6791666666666667 | 491.63 |
| 0.6798611111111111 | 495.176 |
| 0.6805555555555555 | 500.575 |
| 0.68125 | 498.764 |
| 0.6819444444444445 | 489.873 |
| 0.6826388888888889 | 482.945 |
| 0.6833333333333332 | 477.854 |
| 0.6840277777777778 | 474.507 |
| 0.6847222222222222 | 474.507 |
| 0.6854166666666667 | 474.507 |
| 0.686111111111111 | 477.854 |
| 0.6868055555555556 | 474.507 |
| 0.6875 | 472.848 |
| 0.6881944444444444 | 471.198 |
| 0.688888888888889 | 469.557 |
| 0.6895833333333333 | 469.557 |
| 0.6902777777777778 | 464.688 |
| 0.6909722222222222 | 458.318 |
| 0.6916666666666668 | 449.011 |
| 0.6923611111111111 | 442.962 |
| 0.6930555555555555 | 438.503 |
| 0.69375 | 434.107 |
| 0.6944444444444445 | 432.656 |
| 0.6951388888888889 | 428.341 |
| 0.6958333333333333 | 425.497 |
| 0.6965277777777777 | 421.278 |
| 0.6972222222222223 | 417.112 |
| 0.6979166666666666 | 411.638 |
| 0.6986111111111111 | 406.25 |
| 0.6993055555555556 | 402.262 |
| 0.7000000000000001 | 398.318 |
| 0.7006944444444444 | 394.415 |
| 0.7013888888888888 | 391.834 |
| 0.7020833333333334 | 391.834 |
| 0.7027777777777778 | 387.995 |
| 0.7034722222222222 | 384.191 |
| 0.7041666666666666 | 379.171 |
| 0.7048611111111112 | 374.206 |
| 0.7055555555555556 | 370.515 |
| 0.7062499999999999 | 366.851 |
| 0.7069444444444444 | 363.212 |
| 0.7076388888888889 | 358.394 |
| 0.7083333333333334 | 353.613 |
| 0.7090277777777777 | 347.682 |
| 0.7097222222222223 | 341.794 |
| 0.7104166666666667 | 335.941 |
| 0.7111111111111111 | 331.279 |
| 0.7118055555555555 | 325.473 |
| 0.7125 | 318.527 |
| 0.7131944444444445 | 312.749 |
| 0.7138888888888889 | 305.819 |
| 0.7145833333333332 | 300.041 |
| 0.7152777777777778 | 293.096 |
| 0.7159722222222222 | 284.967 |
| 0.7166666666666667 | 277.967 |
| 0.717361111111111 | 270.931 |
| 0.7180555555555556 | 263.851 |
| 0.71875 | 256.722 |
| 0.7194444444444444 | 249.538 |
| 0.720138888888889 | 243.507 |
| 0.7208333333333333 | 234.99 |
| 0.7215277777777778 | 227.618 |
| 0.7222222222222222 | 218.93 |
| 0.7229166666666668 | 210.144 |
| 0.7236111111111111 | 199.98 |
| 0.7243055555555555 | 189.685 |
| 0.725 | 179.258 |
| 0.7256944444444445 | 168.703 |
| 0.7263888888888889 | 158.022 |
| 0.7270833333333333 | 145.865 |
| 0.7277777777777777 | 134.943 |
| 0.7284722222222223 | 122.538 |
| 0.7291666666666666 | 112.814 |
| 0.7298611111111111 | 103.035 |
| 0.7305555555555556 | 91.806 |
| 0.7312500000000001 | 81.946 |
| 0.7319444444444444 | 73.481 |
| 0.7326388888888888 | 65.012 |
| 0.7333333333333334 | 57.958 |
| 0.7340277777777778 | 52.322 |
| 0.7347222222222222 | 48.1 |
| 0.7354166666666666 | 42.483 |
| 0.7361111111111112 | 38.28 |
| 0.7368055555555556 | 34.086 |
| 0.7374999999999999 | 31.297 |
| 0.7381944444444444 | 28.514 |
| 0.7388888888888889 | 24.35 |
| 0.7395833333333334 | 21.582 |
| 0.7402777777777777 | 20.201 |
| 0.7409722222222223 | 16.069 |
| 0.7416666666666667 | 14.696 |
| 0.7423611111111111 | 11.956 |
| 0.7430555555555555 | 10.589 |
| 0.74375 | 9.225 |
| 0.7444444444444445 | 7.862 |
| 0.7451388888888889 | 6.503 |
| 0.7458333333333332 | 5.146 |
| 0.7465277777777778 | 3.791 |
| 0.7472222222222222 | 3.791 |
| 0.7479166666666667 | 2.439 |
| 0.748611111111111 | 1.09 |
| 0.7493055555555556 | 1.09 |
| 0.75 | 1.09 |
| 0.7506944444444444 | -0.256 |
| 0.751388888888889 | -0.256 |
| 0.7520833333333333 | -0.256 |
| 0.7527777777777778 | -0.256 |
| 0.7534722222222222 | -0.256 |
| 0.7541666666666668 | -0.256 |
| 0.7548611111111111 | -0.256 |
| 0.7555555555555555 | -0.256 |
| 0.75625 | -0.256 |
| 0.7569444444444445 | -0.256 |
| 0.7576388888888889 | -0.256 |
| 0.7583333333333333 | -0.256 |
| 0.7590277777777777 | -0.256 |
| 0.7597222222222223 | -0.256 |
| 0.7604166666666666 | -0.256 |
| 0.7611111111111111 | -0.256 |
| 0.7618055555555556 | -0.256 |
| 0.7625000000000001 | -0.256 |
| 0.7631944444444444 | -0.256 |
| 0.7638888888888888 | -0.256 |
| 0.7645833333333334 | -0.256 |
| 0.7652777777777778 | -0.256 |
| 0.7659722222222222 | -0.256 |
| 0.7666666666666666 | -0.256 |
| 0.7673611111111112 | -0.256 |
| 0.7680555555555556 | -0.256 |
| 0.7687499999999999 | -0.256 |
| 0.7694444444444444 | -0.256 |
| 0.7701388888888889 | -0.256 |
| 0.7708333333333334 | -0.256 |
| 0.7715277777777777 | -0.256 |
| 0.7722222222222223 | -0.256 |
| 0.7729166666666667 | -0.256 |
| 0.7736111111111111 | -0.256 |
| 0.7743055555555555 | -0.256 |
| 0.775 | -0.256 |
| 0.7756944444444445 | -0.256 |
| 0.7763888888888889 | -0.256 |
| 0.7770833333333332 | -0.256 |
| 0.7777777777777778 | -0.256 |
| 0.7784722222222222 | -0.256 |
| 0.7791666666666667 | -0.256 |
| 0.779861111111111 | -0.256 |
| 0.7805555555555556 | -0.256 |
| 0.78125 | -0.256 |
| 0.7819444444444444 | -0.256 |
| 0.782638888888889 | -0.256 |
| 0.7833333333333333 | -0.256 |
| 0.7840277777777778 | -0.256 |
| 0.7847222222222222 | -0.256 |
| 0.7854166666666668 | -0.256 |
| 0.7861111111111111 | -0.256 |
| 0.7868055555555555 | -0.256 |
| 0.7875 | -0.256 |
| 0.7881944444444445 | -0.256 |
| 0.7888888888888889 | -0.256 |
| 0.7895833333333333 | -0.256 |
| 0.7902777777777777 | -0.256 |
| 0.7909722222222223 | -0.256 |
| 0.7916666666666666 | -0.256 |
| 0.7923611111111111 | -0.256 |
| 0.7930555555555556 | -0.256 |
| 0.7937500000000001 | -0.256 |
| 0.7944444444444444 | -0.256 |
| 0.7951388888888888 | -0.256 |
| 0.7958333333333334 | -0.256 |
| 0.7965277777777778 | -0.256 |
| 0.7972222222222222 | -0.256 |
| 0.7979166666666666 | -0.256 |
| 0.7986111111111112 | -0.256 |
| 0.7993055555555556 | -0.256 |
| 0.7999999999999999 | -0.256 |
| 0.8006944444444444 | -0.256 |
| 0.8013888888888889 | -0.256 |
| 0.8020833333333334 | -0.256 |
| 0.8027777777777777 | -0.256 |
| 0.8034722222222223 | -0.256 |
| 0.8041666666666667 | -0.256 |
| 0.8048611111111111 | -0.256 |
| 0.8055555555555555 | -0.256 |
| 0.80625 | -0.256 |
| 0.8069444444444445 | -0.256 |
| 0.8076388888888889 | -0.256 |
| 0.8083333333333332 | -0.256 |
| 0.8090277777777778 | -0.256 |
| 0.8097222222222222 | -0.256 |
| 0.8104166666666667 | -0.256 |
| 0.811111111111111 | -0.256 |
| 0.8118055555555556 | -0.256 |
| 0.8125 | -0.256 |
| 0.8131944444444444 | -0.256 |
| 0.813888888888889 | -0.256 |
| 0.8145833333333333 | -0.256 |
| 0.8152777777777778 | -0.256 |
| 0.8159722222222222 | -0.256 |
| 0.8166666666666668 | -0.256 |
| 0.8173611111111111 | -0.256 |
| 0.8180555555555555 | -0.256 |
| 0.81875 | -0.256 |
| 0.8194444444444445 | -0.256 |
| 0.8201388888888889 | -0.256 |
| 0.8208333333333333 | -0.256 |
| 0.8215277777777777 | -0.256 |
| 0.8222222222222223 | -0.256 |
| 0.8229166666666666 | -0.256 |
| 0.8236111111111111 | -0.256 |
| 0.8243055555555556 | -0.256 |
| 0.8250000000000001 | -0.256 |
| 0.8256944444444444 | -0.256 |
| 0.8263888888888888 | -0.256 |
| 0.8270833333333334 | -0.256 |
| 0.8277777777777778 | -0.256 |
| 0.8284722222222222 | -0.256 |
| 0.8291666666666666 | -0.256 |
| 0.8298611111111112 | -0.256 |
| 0.8305555555555556 | -0.256 |
| 0.8312499999999999 | -0.256 |
| 0.8319444444444444 | -0.256 |
| 0.8326388888888889 | -0.256 |
| 0.8333333333333334 | -0.256 |
| 0.8340277777777777 | -0.256 |
| 0.8347222222222223 | -0.256 |
| 0.8354166666666667 | -0.256 |
| 0.8361111111111111 | -0.256 |
| 0.8368055555555555 | -0.256 |
| 0.8375 | -0.256 |
| 0.8381944444444445 | -0.256 |
| 0.8388888888888889 | -0.256 |
| 0.8395833333333332 | -0.256 |
| 0.8402777777777778 | -0.256 |
| 0.8409722222222222 | -0.256 |
| 0.8416666666666667 | -0.256 |
| 0.842361111111111 | -0.256 |
| 0.8430555555555556 | -0.256 |
| 0.84375 | -0.256 |
| 0.8444444444444444 | -0.256 |
| 0.845138888888889 | -0.256 |
| 0.8458333333333333 | -0.256 |
| 0.8465277777777778 | -0.256 |
| 0.8472222222222222 | -0.256 |
| 0.8479166666666668 | -0.256 |
| 0.8486111111111111 | -0.256 |
| 0.8493055555555555 | -0.256 |
| 0.85 | -0.256 |
| 0.8506944444444445 | -0.256 |
| 0.8513888888888889 | -0.256 |
| 0.8520833333333333 | -0.256 |
| 0.8527777777777777 | -0.256 |
| 0.8534722222222223 | -0.256 |
| 0.8541666666666666 | -0.256 |
| 0.8548611111111111 | -0.256 |
| 0.8555555555555556 | -0.256 |
| 0.8562500000000001 | -0.256 |
| 0.8569444444444444 | -0.256 |
| 0.8576388888888888 | -0.256 |
| 0.8583333333333334 | -0.256 |
| 0.8590277777777778 | -0.256 |
| 0.8597222222222222 | -0.256 |
| 0.8604166666666666 | -0.256 |
| 0.8611111111111112 | -0.256 |
| 0.8618055555555556 | -0.256 |
| 0.8624999999999999 | -0.256 |
| 0.8631944444444444 | -0.256 |
| 0.8638888888888889 | -0.256 |
| 0.8645833333333334 | -0.256 |
| 0.8652777777777777 | -0.256 |
| 0.8659722222222223 | -0.256 |
| 0.8666666666666667 | -0.256 |
| 0.8673611111111111 | -0.256 |
| 0.8680555555555555 | -0.256 |
| 0.86875 | -0.256 |
| 0.8694444444444445 | -0.256 |
| 0.8701388888888889 | -0.256 |
| 0.8708333333333332 | -0.256 |
| 0.8715277777777778 | -0.256 |
| 0.8722222222222222 | -0.256 |
| 0.8729166666666667 | -0.256 |
| 0.873611111111111 | -0.256 |
| 0.8743055555555556 | -0.256 |
| 0.875 | -0.256 |
| 0.8756944444444444 | -0.256 |
| 0.876388888888889 | -0.256 |
| 0.8770833333333333 | -0.256 |
| 0.8777777777777778 | -0.256 |
| 0.8784722222222222 | -0.256 |
| 0.8791666666666668 | -0.256 |
| 0.8798611111111111 | -0.256 |
| 0.8805555555555555 | -0.256 |
| 0.88125 | -0.256 |
| 0.8819444444444445 | -0.256 |
| 0.8826388888888889 | -0.256 |
| 0.8833333333333333 | -0.256 |
| 0.8840277777777777 | -0.256 |
| 0.8847222222222223 | -0.256 |
| 0.8854166666666666 | -0.256 |
| 0.8861111111111111 | -0.256 |
| 0.8868055555555556 | -0.256 |
| 0.8875000000000001 | -0.256 |
| 0.8881944444444444 | -0.256 |
| 0.8888888888888888 | -0.256 |
| 0.8895833333333334 | -0.256 |
| 0.8902777777777778 | -0.256 |
| 0.8909722222222222 | -0.256 |
| 0.8916666666666666 | -0.256 |
| 0.8923611111111112 | -0.256 |
| 0.8930555555555556 | -0.256 |
| 0.8937499999999999 | -0.256 |
| 0.8944444444444444 | -0.256 |
| 0.8951388888888889 | -0.256 |
| 0.8958333333333334 | -0.256 |
| 0.8965277777777777 | -0.256 |
| 0.8972222222222223 | -0.256 |
| 0.8979166666666667 | -0.256 |
| 0.8986111111111111 | -0.256 |
| 0.8993055555555555 | -0.256 |
| 0.9 | -0.256 |
| 0.9006944444444445 | -0.256 |
| 0.9013888888888889 | -0.256 |
| 0.9020833333333332 | -0.256 |
| 0.9027777777777778 | -0.256 |
| 0.9034722222222222 | -0.256 |
| 0.9041666666666667 | -0.256 |
| 0.904861111111111 | -0.256 |
| 0.9055555555555556 | -0.256 |
| 0.90625 | -0.256 |
| 0.9069444444444444 | -0.256 |
| 0.907638888888889 | -0.256 |
| 0.9083333333333333 | -0.256 |
| 0.9090277777777778 | -0.256 |
| 0.9097222222222222 | -0.256 |
| 0.9104166666666668 | -0.256 |
| 0.9111111111111111 | -0.256 |
| 0.9118055555555555 | -0.256 |
| 0.9125 | -0.256 |
| 0.9131944444444445 | -0.256 |
| 0.9138888888888889 | -0.256 |
| 0.9145833333333333 | -0.256 |
| 0.9152777777777777 | -0.256 |
| 0.9159722222222223 | -0.256 |
| 0.9166666666666666 | -0.256 |
| 0.9173611111111111 | -0.256 |
| 0.9180555555555556 | -0.256 |
| 0.9187500000000001 | -0.256 |
| 0.9194444444444444 | -0.256 |
| 0.9201388888888888 | -0.256 |
| 0.9208333333333334 | -0.256 |
| 0.9215277777777778 | -0.256 |
| 0.9222222222222222 | -0.256 |
| 0.9229166666666666 | -0.256 |
| 0.9236111111111112 | -0.256 |
| 0.9243055555555556 | -0.256 |
| 0.9249999999999999 | -0.256 |
| 0.9256944444444444 | -0.256 |
| 0.9263888888888889 | -0.256 |
| 0.9270833333333334 | -0.256 |
| 0.9277777777777777 | -0.256 |
| 0.9284722222222223 | -0.256 |
| 0.9291666666666667 | -0.256 |
| 0.9298611111111111 | -0.256 |
| 0.9305555555555555 | -0.256 |
| 0.93125 | -0.256 |
| 0.9319444444444445 | -0.256 |
| 0.9326388888888889 | -0.256 |
| 0.9333333333333332 | -0.256 |
| 0.9340277777777778 | -0.256 |
| 0.9347222222222222 | -0.256 |
| 0.9354166666666667 | -0.256 |
| 0.936111111111111 | -0.256 |
| 0.9368055555555556 | -0.256 |
| 0.9375 | -0.256 |
| 0.9381944444444444 | -0.256 |
| 0.938888888888889 | -0.256 |
| 0.9395833333333333 | -0.256 |
| 0.9402777777777778 | -0.256 |
| 0.9409722222222222 | -0.256 |
| 0.9416666666666668 | -0.256 |
| 0.9423611111111111 | -0.256 |
| 0.9430555555555555 | -0.256 |
| 0.94375 | -0.256 |
| 0.9444444444444445 | -0.256 |
| 0.9451388888888889 | -0.256 |
| 0.9458333333333333 | -0.256 |
| 0.9465277777777777 | -0.256 |
| 0.9472222222222223 | -0.256 |
| 0.9479166666666666 | -0.256 |
| 0.9486111111111111 | -0.256 |
| 0.9493055555555556 | -0.256 |
| 0.9500000000000001 | -0.256 |
| 0.9506944444444444 | -0.256 |
| 0.9513888888888888 | -0.256 |
| 0.9520833333333334 | -0.256 |
| 0.9527777777777778 | -0.256 |
| 0.9534722222222222 | -0.256 |
| 0.9541666666666666 | -0.256 |
| 0.9548611111111112 | -0.256 |
| 0.9555555555555556 | -0.256 |
| 0.9562499999999999 | -0.256 |
| 0.9569444444444444 | -0.256 |
| 0.9576388888888889 | -0.256 |
| 0.9583333333333334 | -0.256 |
| 0.9590277777777777 | -0.256 |
| 0.9597222222222223 | -0.256 |
| 0.9604166666666667 | -0.256 |
| 0.9611111111111111 | -0.256 |
| 0.9618055555555555 | -0.256 |
| 0.9625 | -0.256 |
| 0.9631944444444445 | -0.256 |
| 0.9638888888888889 | -0.256 |
| 0.9645833333333332 | -0.256 |
| 0.9652777777777778 | -0.256 |
| 0.9659722222222222 | -0.256 |
| 0.9666666666666667 | -0.256 |
| 0.967361111111111 | -0.256 |
| 0.9680555555555556 | -0.256 |
| 0.96875 | -0.256 |
| 0.9694444444444444 | -0.256 |
| 0.970138888888889 | -0.256 |
| 0.9708333333333333 | -0.256 |
| 0.9715277777777778 | -0.256 |
| 0.9722222222222222 | -0.256 |
| 0.9729166666666668 | -0.256 |
| 0.9736111111111111 | -0.256 |
| 0.9743055555555555 | -0.256 |
| 0.975 | -0.256 |
| 0.9756944444444445 | -0.256 |
| 0.9763888888888889 | -0.256 |
| 0.9770833333333333 | -0.256 |
| 0.9777777777777777 | -0.256 |
| 0.9784722222222223 | -0.256 |
| 0.9791666666666666 | -0.256 |
| 0.9798611111111111 | -0.256 |
| 0.9805555555555556 | -0.256 |
| 0.9812500000000001 | -0.256 |
| 0.9819444444444444 | -0.256 |
| 0.9826388888888888 | -0.256 |
| 0.9833333333333334 | -0.256 |
| 0.9840277777777778 | -0.256 |
| 0.9847222222222222 | -0.256 |
| 0.9854166666666666 | -0.256 |
| 0.9861111111111112 | -0.256 |
| 0.9868055555555556 | -0.256 |
| 0.9874999999999999 | -0.256 |
| 0.9881944444444444 | -0.256 |
| 0.9888888888888889 | -0.256 |
| 0.9895833333333334 | -0.256 |
| 0.9902777777777777 | -0.256 |
| 0.9909722222222223 | -0.256 |
| 0.9916666666666667 | -0.256 |
| 0.9923611111111111 | -0.256 |
| 0.9930555555555555 | -0.256 |
| 0.99375 | -0.256 |
| 0.9944444444444445 | -0.256 |
| 0.9951388888888889 | -0.256 |
| 0.9958333333333332 | -0.256 |
| 0.9965277777777778 | -0.256 |
| 0.9972222222222222 | -0.256 |
| 0.9979166666666667 | -0.256 |
| 0.998611111111111 | -0.256 |
| 0.9993055555555556 | 0 |